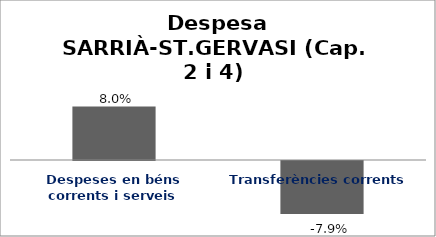
| Category | Series 0 |
|---|---|
| Despeses en béns corrents i serveis | 0.08 |
| Transferències corrents | -0.079 |